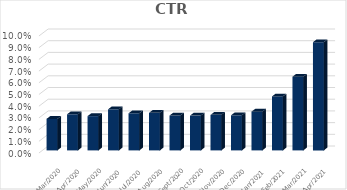
| Category | CTR |
|---|---|
| 2021-04-30 | 0.092 |
| 2021-03-31 | 0.063 |
| 2021-02-28 | 0.046 |
| 2021-01-31 | 0.033 |
| 2020-12-31 | 0.03 |
| 2020-11-30 | 0.03 |
| 2020-10-31 | 0.03 |
| 2020-09-30 | 0.03 |
| 2020-08-31 | 0.032 |
| 2020-07-31 | 0.032 |
| 2020-06-30 | 0.035 |
| 2020-05-31 | 0.029 |
| 2020-04-30 | 0.031 |
| 2020-03-31 | 0.027 |